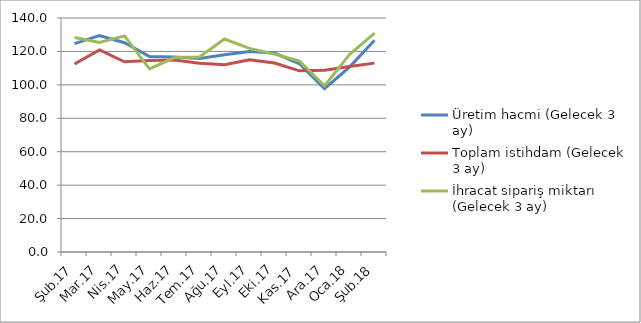
| Category | Üretim hacmi (Gelecek 3 ay) | Toplam istihdam (Gelecek 3 ay) | İhracat sipariş miktarı (Gelecek 3 ay) |
|---|---|---|---|
| Şub.17 | 124.7 | 112.5 | 128.3 |
| Mar.17 | 129.5 | 120.9 | 125.4 |
| Nis.17 | 125.2 | 113.8 | 129.3 |
| May.17 | 116.9 | 114.5 | 109.6 |
| Haz.17 | 116.6 | 114.9 | 116.3 |
| Tem.17 | 115.8 | 112.9 | 116.7 |
| Ağu.17 | 118 | 112.1 | 127.4 |
| Eyl.17 | 120 | 115 | 121.8 |
| Eki.17 | 119 | 113.1 | 118.4 |
| Kas.17 | 112.6 | 108.4 | 114.2 |
| Ara.17 | 97.7 | 108.7 | 99.4 |
| Oca.18 | 110.6 | 111 | 118.1 |
| Şub.18 | 126.7 | 113 | 130.9 |